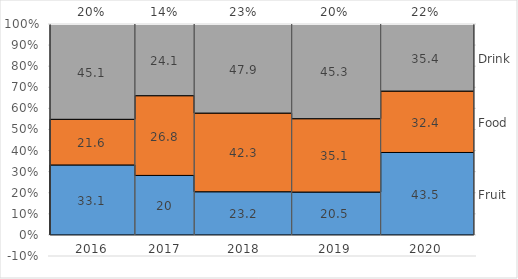
| Category | Fruit | Food | Drink |
|---|---|---|---|
| 0.0 | 0.332 | 0.216 | 0.452 |
| 20.108805158170465 | 0.332 | 0.216 | 0.452 |
| 20.108805158170465 | 0.282 | 0.378 | 0.34 |
| 34.394519443884754 | 0.282 | 0.378 | 0.34 |
| 34.394519443884754 | 0.205 | 0.373 | 0.422 |
| 57.243602659681656 | 0.205 | 0.373 | 0.422 |
| 57.243602659681656 | 0.203 | 0.348 | 0.449 |
| 77.57404795486602 | 0.203 | 0.348 | 0.449 |
| 77.57404795486602 | 0.391 | 0.291 | 0.318 |
| 100.0 | 0.391 | 0.291 | 0.318 |